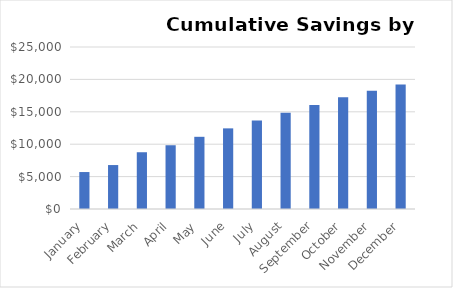
| Category | CUMULATIVE SAVINGS |
|---|---|
| January | 5704.2 |
| February | 6781.9 |
| March | 8759.6 |
| April | 9838.8 |
| May | 11141 |
| June | 12443.2 |
| July | 13645.4 |
| August | 14847.6 |
| September | 16049.8 |
| October | 17252 |
| November | 18231.2 |
| December | 19210.4 |